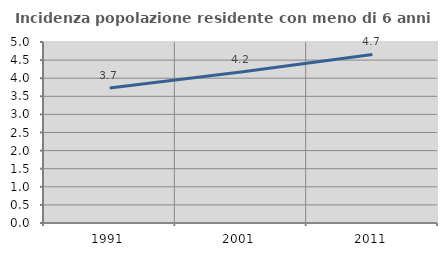
| Category | Incidenza popolazione residente con meno di 6 anni |
|---|---|
| 1991.0 | 3.727 |
| 2001.0 | 4.168 |
| 2011.0 | 4.655 |